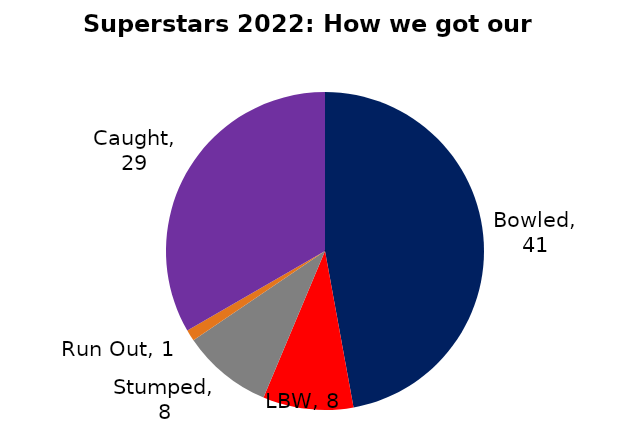
| Category | BOWLING |
|---|---|
| Bowled | 41 |
| LBW | 8 |
| Stumped | 8 |
| Run Out | 1 |
| Caught | 29 |